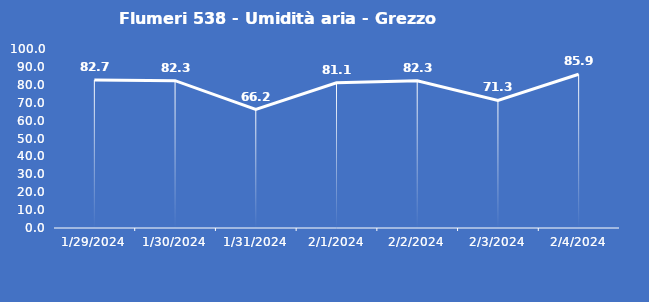
| Category | Flumeri 538 - Umidità aria - Grezzo (%) |
|---|---|
| 1/29/24 | 82.7 |
| 1/30/24 | 82.3 |
| 1/31/24 | 66.2 |
| 2/1/24 | 81.1 |
| 2/2/24 | 82.3 |
| 2/3/24 | 71.3 |
| 2/4/24 | 85.9 |